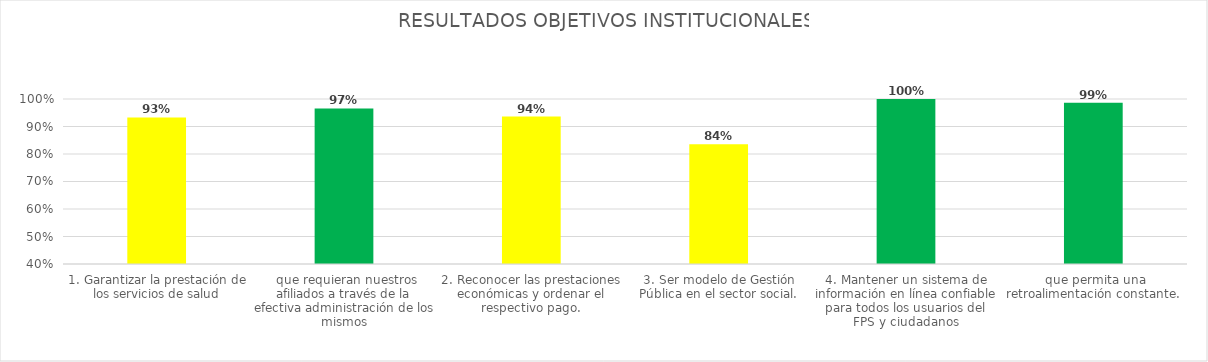
| Category | Total |
|---|---|
| 1. Garantizar la prestación de los servicios de salud, que requieran nuestros afiliados a través de la efectiva administración de los mismos | 0.933 |
| 2. Reconocer las prestaciones económicas y ordenar el respectivo pago. | 0.966 |
| 3. Ser modelo de Gestión Pública en el sector social. | 0.936 |
| 4. Mantener un sistema de información en línea confiable para todos los usuarios del FPS y ciudadanos, que permita una retroalimentación constante. | 0.836 |
| 5. Fortalecer la administración de los bienes de la entidad y la óptima gestión de los recursos. | 1 |
| 6. Fortalecer los mecanismos de comunicación organizacional e informativa para proyectar los resultados de la Gestión de la Entidad. | 0.987 |